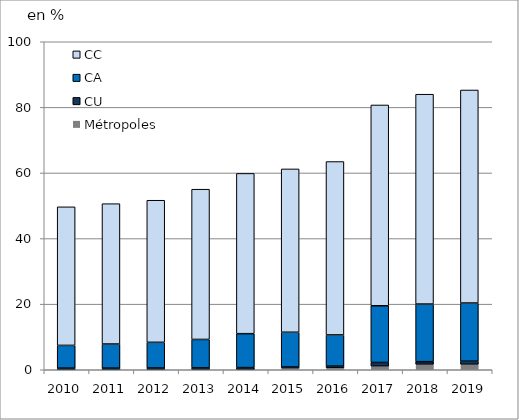
| Category | Métropoles | CU | CA | CC |
|---|---|---|---|---|
| 2010.0 | 0 | 0.498 | 6.932 | 42.244 |
| 2011.0 | 0 | 0.5 | 7.349 | 42.786 |
| 2012.0 | 0.039 | 0.504 | 7.826 | 43.317 |
| 2013.0 | 0.041 | 0.529 | 8.673 | 45.806 |
| 2014.0 | 0.047 | 0.606 | 10.35 | 48.858 |
| 2015.0 | 0.516 | 0.328 | 10.595 | 49.789 |
| 2016.0 | 0.63 | 0.485 | 9.505 | 52.861 |
| 2017.0 | 1.106 | 1.106 | 17.299 | 61.216 |
| 2018.0 | 1.663 | 0.792 | 17.577 | 63.975 |
| 2019.0 | 1.669 | 0.954 | 17.727 | 64.944 |